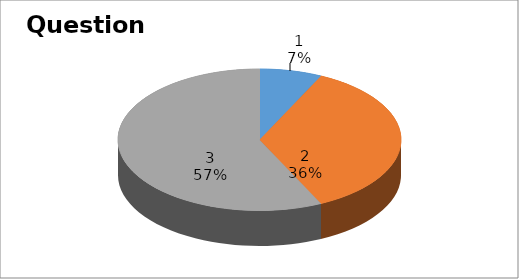
| Category | Series 0 |
|---|---|
| 0 | 1 |
| 1 | 5 |
| 2 | 8 |